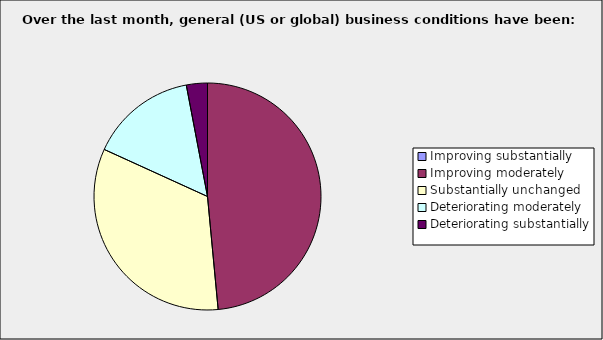
| Category | Series 0 |
|---|---|
| Improving substantially | 0 |
| Improving moderately | 0.485 |
| Substantially unchanged | 0.333 |
| Deteriorating moderately | 0.152 |
| Deteriorating substantially | 0.03 |